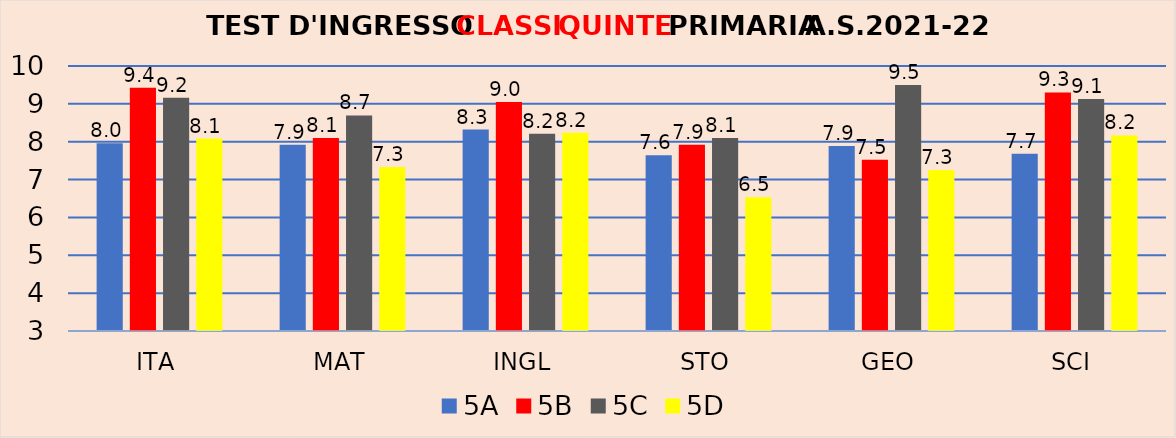
| Category | 5A | 5B | 5C | 5D |
|---|---|---|---|---|
| ITA | 7.96 | 9.429 | 9.16 | 8.083 |
| MAT | 7.92 | 8.1 | 8.696 | 7.333 |
| INGL | 8.32 | 9.048 | 8.208 | 8.235 |
| STO | 7.64 | 7.923 | 8.1 | 6.533 |
| GEO | 7.889 | 7.524 | 9.5 | 7.25 |
| SCI | 7.68 | 9.3 | 9.13 | 8.167 |